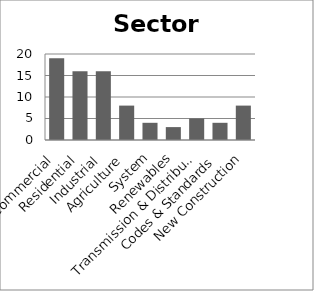
| Category | Sector Experience |
|---|---|
| Commercial | 19 |
| Residential | 16 |
| Industrial | 16 |
| Agriculture | 8 |
| System | 4 |
| Renewables | 3 |
| Transmission & Distribution | 5 |
| Codes & Standards | 4 |
| New Construction | 8 |